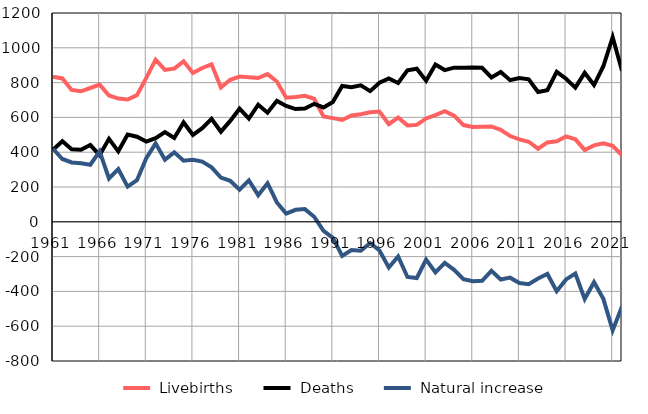
| Category |  Livebirths |  Deaths |  Natural increase |
|---|---|---|---|
| 1961.0 | 834 | 414 | 420 |
| 1962.0 | 824 | 463 | 361 |
| 1963.0 | 758 | 417 | 341 |
| 1964.0 | 750 | 414 | 336 |
| 1965.0 | 769 | 441 | 328 |
| 1966.0 | 788 | 383 | 405 |
| 1967.0 | 726 | 477 | 249 |
| 1968.0 | 708 | 405 | 303 |
| 1969.0 | 703 | 501 | 202 |
| 1970.0 | 728 | 489 | 239 |
| 1971.0 | 827 | 461 | 366 |
| 1972.0 | 932 | 481 | 451 |
| 1973.0 | 873 | 516 | 357 |
| 1974.0 | 881 | 482 | 399 |
| 1975.0 | 922 | 571 | 351 |
| 1976.0 | 855 | 499 | 356 |
| 1977.0 | 884 | 538 | 346 |
| 1978.0 | 905 | 592 | 313 |
| 1979.0 | 772 | 518 | 254 |
| 1980.0 | 816 | 580 | 236 |
| 1981.0 | 835 | 650 | 185 |
| 1982.0 | 831 | 593 | 238 |
| 1983.0 | 826 | 673 | 153 |
| 1984.0 | 849 | 627 | 222 |
| 1985.0 | 806 | 695 | 111 |
| 1986.0 | 713 | 666 | 47 |
| 1987.0 | 717 | 648 | 69 |
| 1988.0 | 724 | 651 | 73 |
| 1989.0 | 707 | 678 | 29 |
| 1990.0 | 605 | 657 | -52 |
| 1991.0 | 596 | 688 | -92 |
| 1992.0 | 585 | 781 | -196 |
| 1993.0 | 611 | 773 | -162 |
| 1994.0 | 618 | 784 | -166 |
| 1995.0 | 629 | 751 | -122 |
| 1996.0 | 634 | 799 | -165 |
| 1997.0 | 561 | 824 | -263 |
| 1998.0 | 599 | 798 | -199 |
| 1999.0 | 554 | 871 | -317 |
| 2000.0 | 557 | 880 | -323 |
| 2001.0 | 594 | 811 | -217 |
| 2002.0 | 613 | 904 | -291 |
| 2003.0 | 636 | 872 | -236 |
| 2004.0 | 610 | 886 | -276 |
| 2005.0 | 556 | 886 | -330 |
| 2006.0 | 545 | 887 | -342 |
| 2007.0 | 546 | 885 | -339 |
| 2008.0 | 548 | 830 | -282 |
| 2009.0 | 529 | 861 | -332 |
| 2010.0 | 493 | 814 | -321 |
| 2011.0 | 474 | 826 | -352 |
| 2012.0 | 460 | 819 | -359 |
| 2013.0 | 420 | 746 | -326 |
| 2014.0 | 456 | 756 | -300 |
| 2015.0 | 463 | 862 | -399 |
| 2016.0 | 491 | 822 | -331 |
| 2017.0 | 474 | 771 | -297 |
| 2018.0 | 413 | 856 | -443 |
| 2019.0 | 439 | 786 | -347 |
| 2020.0 | 451 | 894 | -443 |
| 2021.0 | 437 | 1061 | -624 |
| 2022.0 | 382 | 868 | -486 |